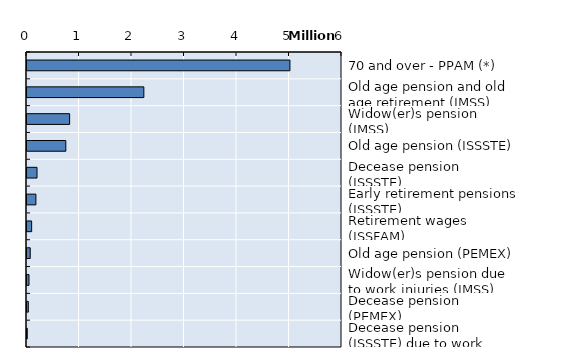
| Category | Series 0 |
|---|---|
| 70 and over - PPAM (*) | 5008306 |
| Old age pension and old age retirement (IMSS) | 2225741 |
| Widow(er)s pension (IMSS) | 811730 |
| Old age pension (ISSSTE) | 739502 |
| Decease pension (ISSSTE) | 190860 |
| Early retirement pensions (ISSSTE) | 169392 |
| Retirement wages (ISSFAM) | 88417 |
| Old age pension (PEMEX) | 61513 |
| Widow(er)s pension due to work injuries (IMSS) | 37964 |
| Decease pension (PEMEX) | 24740 |
| Decease pension (ISSSTE) due to work injury | 5190 |